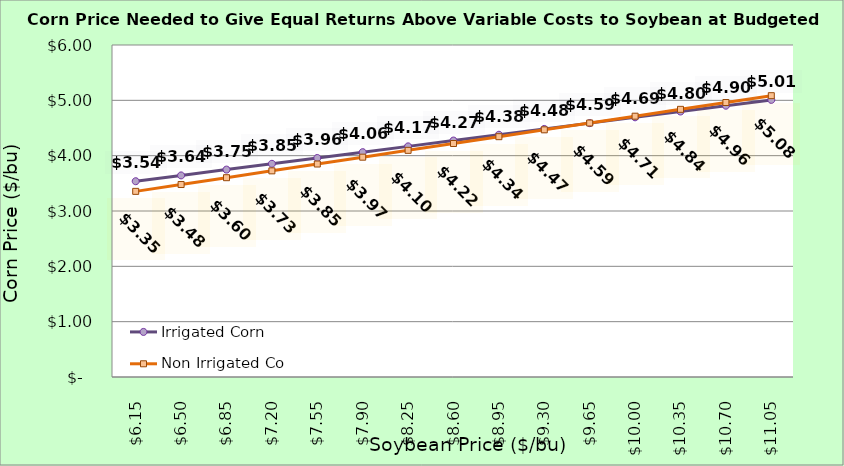
| Category | Irrigated Corn | Non Irrigated Corn |
|---|---|---|
| 6.150000000000002 | 3.538 | 3.355 |
| 6.500000000000002 | 3.643 | 3.478 |
| 6.850000000000001 | 3.748 | 3.602 |
| 7.200000000000001 | 3.853 | 3.726 |
| 7.550000000000001 | 3.958 | 3.849 |
| 7.9 | 4.063 | 3.973 |
| 8.25 | 4.168 | 4.096 |
| 8.6 | 4.273 | 4.22 |
| 8.95 | 4.378 | 4.343 |
| 9.299999999999999 | 4.483 | 4.467 |
| 9.649999999999999 | 4.588 | 4.59 |
| 9.999999999999998 | 4.693 | 4.714 |
| 10.349999999999998 | 4.798 | 4.837 |
| 10.699999999999998 | 4.903 | 4.961 |
| 11.049999999999997 | 5.008 | 5.084 |